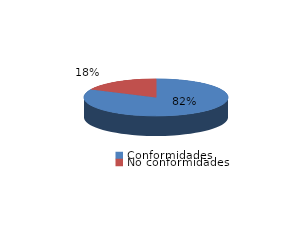
| Category | Series 0 |
|---|---|
| Conformidades | 1011 |
| No conformidades | 220 |